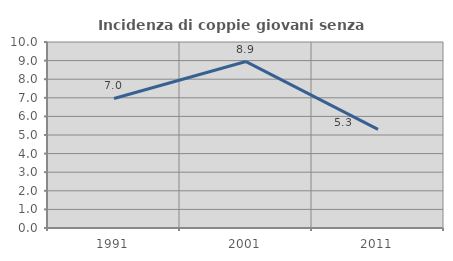
| Category | Incidenza di coppie giovani senza figli |
|---|---|
| 1991.0 | 6.965 |
| 2001.0 | 8.948 |
| 2011.0 | 5.305 |